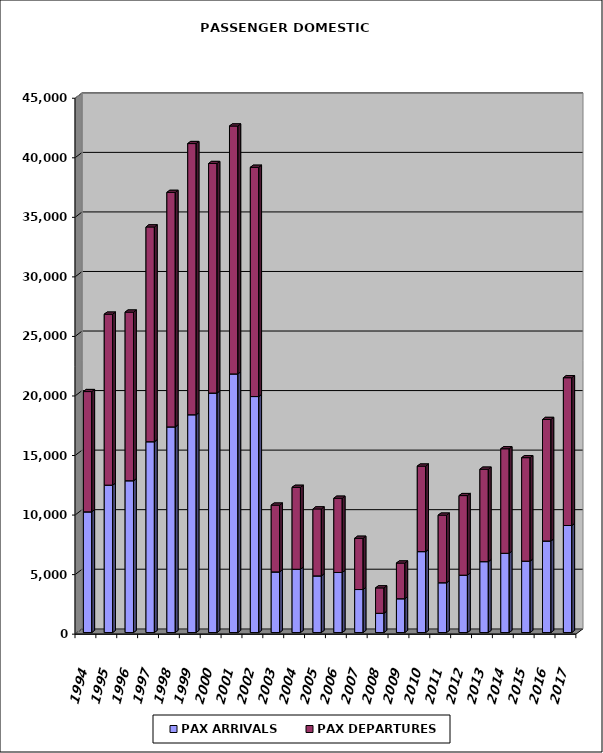
| Category | PAX ARRIVALS | PAX DEPARTURES |
|---|---|---|
| 1994.0 | 10134 | 10100 |
| 1995.0 | 12377 | 14355 |
| 1996.0 | 12748 | 14158 |
| 1997.0 | 16023 | 18035 |
| 1998.0 | 17269 | 19688 |
| 1999.0 | 18289 | 22769 |
| 2000.0 | 20110 | 19273 |
| 2001.0 | 21718 | 20814 |
| 2002.0 | 19817 | 19248 |
| 2003.0 | 5091 | 5607 |
| 2004.0 | 5317 | 6875 |
| 2005.0 | 4758 | 5621 |
| 2006.0 | 5045 | 6232 |
| 2007.0 | 3612 | 4302 |
| 2008.0 | 1617 | 2133 |
| 2009.0 | 2840 | 2995 |
| 2010.0 | 6796 | 7179 |
| 2011.0 | 4183 | 5674 |
| 2012.0 | 4818 | 6682 |
| 2013.0 | 5954 | 7761 |
| 2014.0 | 6654 | 8778 |
| 2015.0 | 5996 | 8688 |
| 2016.0 | 7689 | 10202 |
| 2017.0 | 8987 | 12410 |